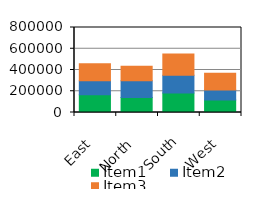
| Category | Item1 | Item2 | Item3 |
|---|---|---|---|
| East | 168136 | 130948 | 158944 |
| North | 142346 | 156328 | 135890 |
| South | 184414 | 166622 | 199509 |
| West | 117249 | 94705 | 156510 |